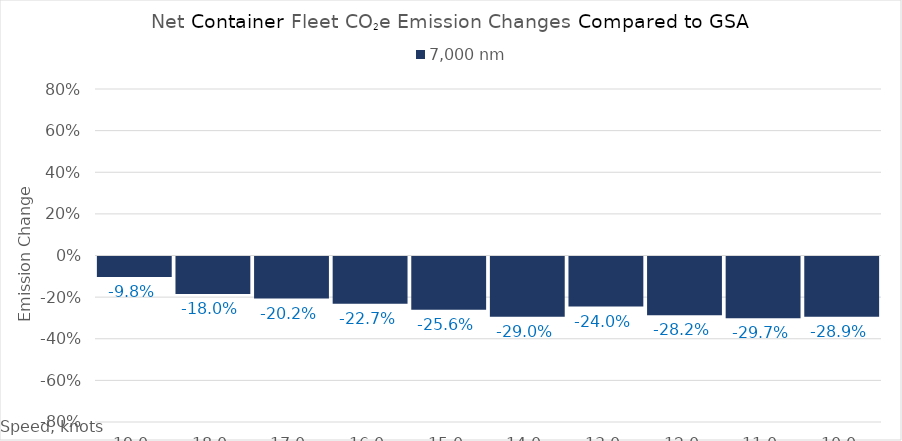
| Category | 7,000 |
|---|---|
| 19.0 | -0.098 |
| 18.0 | -0.18 |
| 17.0 | -0.202 |
| 16.0 | -0.227 |
| 15.0 | -0.256 |
| 14.0 | -0.29 |
| 13.0 | -0.24 |
| 12.0 | -0.282 |
| 11.0 | -0.297 |
| 10.0 | -0.289 |